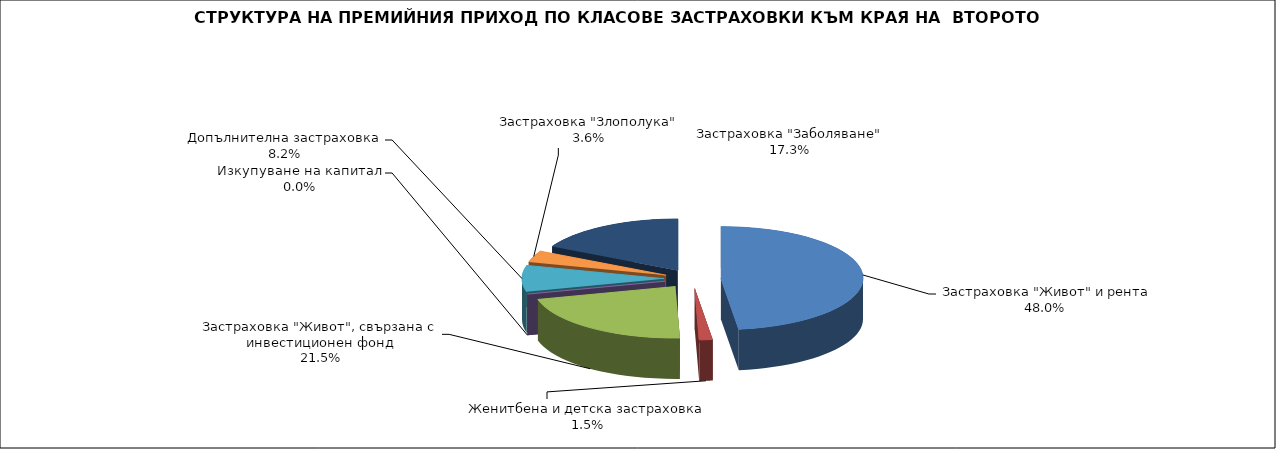
| Category |  Застраховка "Живот" и рента |
|---|---|
|  Застраховка "Живот" и рента | 109193821.483 |
| Женитбена и детска застраховка | 3445768.108 |
| Застраховка "Живот", свързана с инвестиционен фонд | 48817080.237 |
| Изкупуване на капитал | 0 |
| Допълнителна застраховка | 18636597.025 |
| Застраховка "Злополука" | 8152764.12 |
| Застраховка "Заболяване" | 39279906.96 |